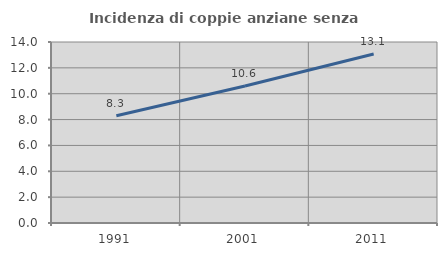
| Category | Incidenza di coppie anziane senza figli  |
|---|---|
| 1991.0 | 8.29 |
| 2001.0 | 10.595 |
| 2011.0 | 13.068 |